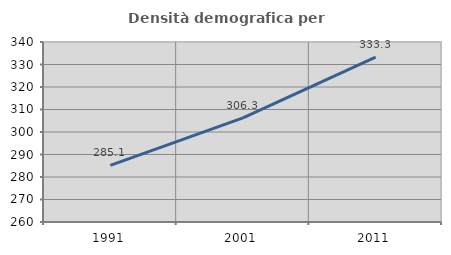
| Category | Densità demografica |
|---|---|
| 1991.0 | 285.131 |
| 2001.0 | 306.292 |
| 2011.0 | 333.291 |